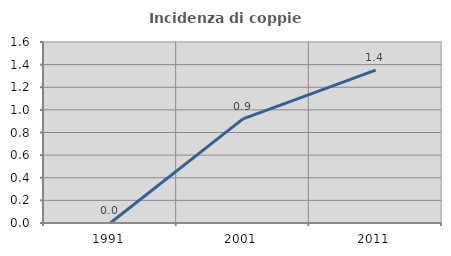
| Category | Incidenza di coppie miste |
|---|---|
| 1991.0 | 0 |
| 2001.0 | 0.921 |
| 2011.0 | 1.351 |